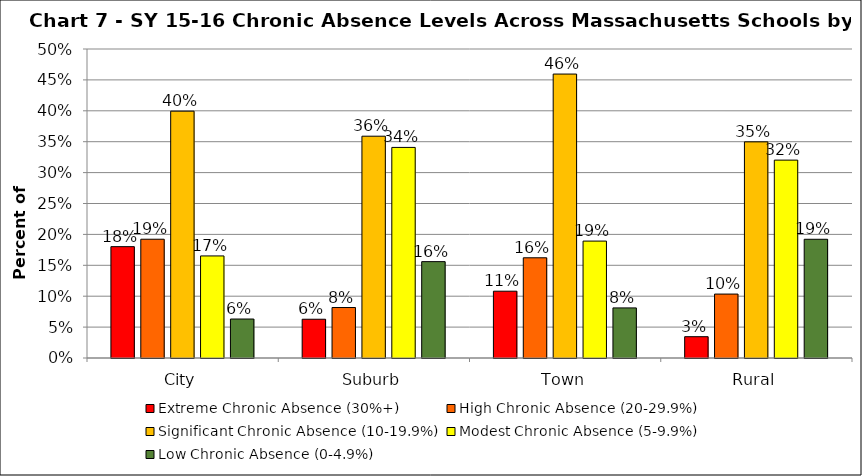
| Category | Extreme Chronic Absence (30%+) | High Chronic Absence (20-29.9%) | Significant Chronic Absence (10-19.9%) | Modest Chronic Absence (5-9.9%) | Low Chronic Absence (0-4.9%) |
|---|---|---|---|---|---|
| 0 | 0.18 | 0.192 | 0.399 | 0.165 | 0.063 |
| 1 | 0.063 | 0.082 | 0.359 | 0.341 | 0.156 |
| 2 | 0.108 | 0.162 | 0.459 | 0.189 | 0.081 |
| 3 | 0.034 | 0.103 | 0.35 | 0.32 | 0.192 |